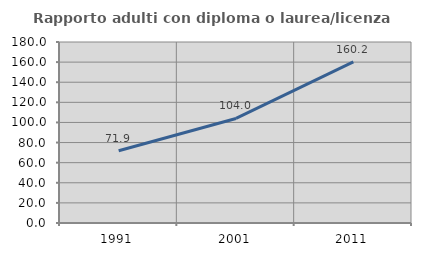
| Category | Rapporto adulti con diploma o laurea/licenza media  |
|---|---|
| 1991.0 | 71.915 |
| 2001.0 | 103.963 |
| 2011.0 | 160.191 |